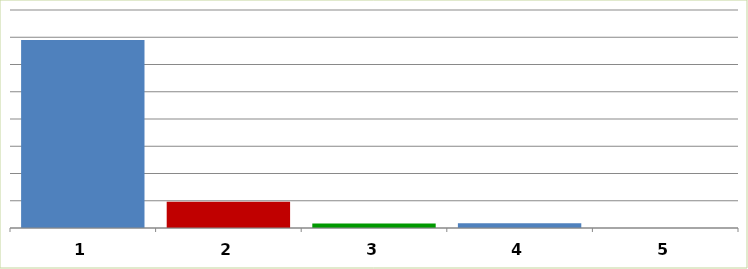
| Category | Series 0 |
|---|---|
| 0 | 68972807 |
| 1 | 9661033 |
| 2 | 1625635 |
| 3 | 1706560 |
| 4 | 0 |